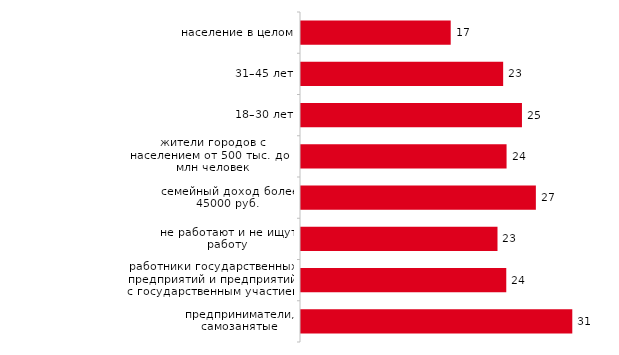
| Category | Покупать что-либо в кредит, в том числе по кредитной карте или карте рассрочки, брать кредит в банке |
|---|---|
| население в целом | 17.18 |
| 31–45 лет | 23.199 |
| 18–30 лет | 25.355 |
| жители городов с населением от 500 тыс. до 1 млн человек | 23.59 |
| семейный доход более 45000 руб. | 26.952 |
| не работают и не ищут работу | 22.549 |
| работники государственных предприятий и предприятий с государственным участием | 23.556 |
| предприниматели, самозанятые | 31.132 |